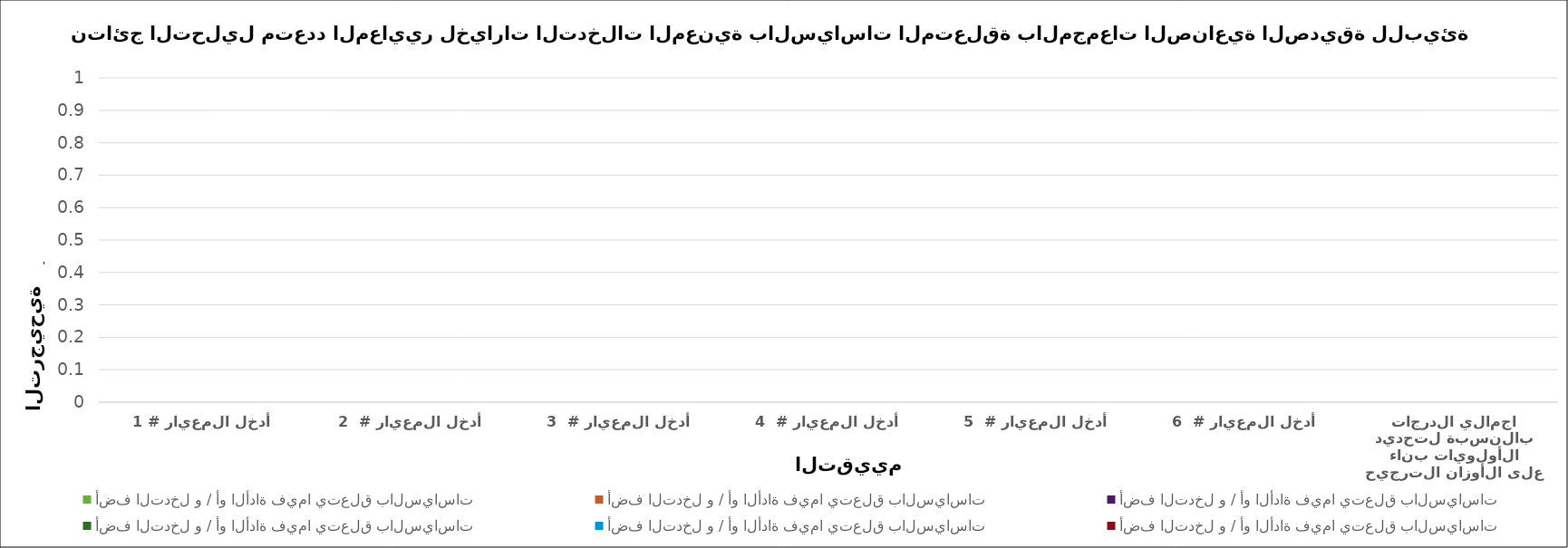
| Category | أضف التدخل و / أو الأداة فيما يتعلق بالسياسات |
|---|---|
| أدخل المعيار # 1 | 0 |
| أدخل المعيار #  2 | 0 |
| أدخل المعيار #  3 | 0 |
| أدخل المعيار #  4 | 0 |
| أدخل المعيار #  5 | 0 |
| أدخل المعيار #  6 | 0 |
| اجمالي الدرجات بالنسبة لتحديد الأولويات بناء على الأوزان الترجيحية | 0 |